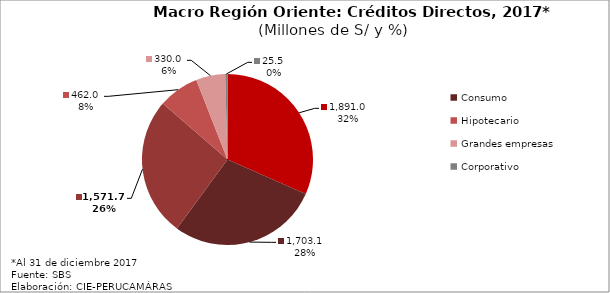
| Category | Series 0 |
|---|---|
| PyMes | 1890.996 |
| Consumo | 1703.144 |
| Emp. Medianas | 1571.714 |
| Hipotecario | 461.985 |
| Grandes empresas | 329.958 |
| Corporativo | 25.473 |